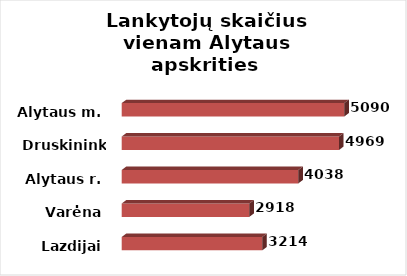
| Category | Series 0 |
|---|---|
| Lazdijai | 3214 |
| Varėna | 2918 |
| Alytaus r. | 4038 |
| Druskininkai | 4969 |
| Alytaus m. | 5090 |